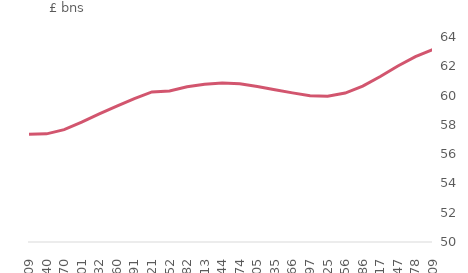
| Category | total |
|---|---|
| 2017-10-01 | 57355.81 |
| 2017-11-01 | 57386.314 |
| 2017-12-01 | 57676.748 |
| 2018-01-01 | 58186.813 |
| 2018-02-01 | 58748.089 |
| 2018-03-01 | 59280.179 |
| 2018-04-01 | 59794.289 |
| 2018-05-01 | 60250.133 |
| 2018-06-01 | 60313.339 |
| 2018-07-01 | 60598.804 |
| 2018-08-01 | 60774.084 |
| 2018-09-01 | 60853.3 |
| 2018-10-01 | 60808.041 |
| 2018-11-01 | 60621.062 |
| 2018-12-01 | 60403.061 |
| 2019-01-01 | 60185.372 |
| 2019-02-01 | 59983.599 |
| 2019-03-01 | 59953.555 |
| 2019-04-01 | 60173.73 |
| 2019-05-01 | 60647.177 |
| 2019-06-01 | 61304.922 |
| 2019-07-01 | 62016.771 |
| 2019-08-01 | 62656.361 |
| 2019-09-01 | 63143.119 |